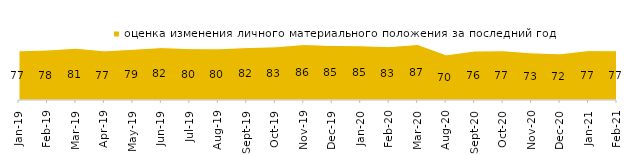
| Category | оценка изменения личного материального положения за последний год |
|---|---|
| 2019-01-01 | 76.7 |
| 2019-02-01 | 77.9 |
| 2019-03-01 | 80.656 |
| 2019-04-01 | 76.584 |
| 2019-05-01 | 79 |
| 2019-06-01 | 81.696 |
| 2019-07-01 | 80.05 |
| 2019-08-01 | 79.77 |
| 2019-09-01 | 81.733 |
| 2019-10-01 | 82.871 |
| 2019-11-01 | 86.436 |
| 2019-12-01 | 85 |
| 2020-01-01 | 84.505 |
| 2020-02-01 | 83.168 |
| 2020-03-01 | 86.564 |
| 2020-08-01 | 70.357 |
| 2020-09-01 | 76.307 |
| 2020-10-01 | 76.731 |
| 2020-11-01 | 73.45 |
| 2020-12-01 | 71.988 |
| 2021-01-01 | 77 |
| 2021-02-01 | 76.774 |